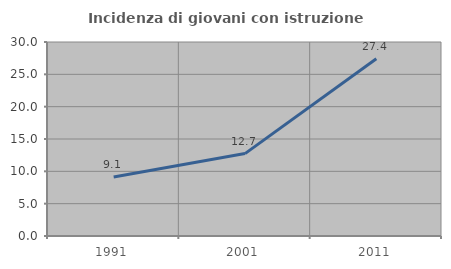
| Category | Incidenza di giovani con istruzione universitaria |
|---|---|
| 1991.0 | 9.111 |
| 2001.0 | 12.742 |
| 2011.0 | 27.414 |